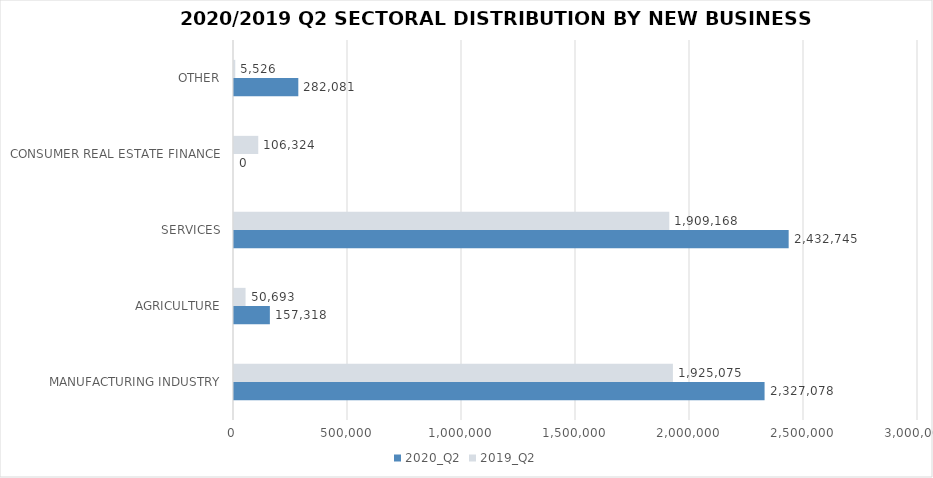
| Category | 2020_Q2 | 2019_Q2 |
|---|---|---|
| MANUFACTURING INDUSTRY | 2327078.197 | 1925075.184 |
| AGRICULTURE | 157318.45 | 50693.285 |
| SERVICES | 2432744.562 | 1909168.04 |
| CONSUMER REAL ESTATE FINANCE | 0 | 106324 |
| OTHER | 282081.38 | 5525.75 |